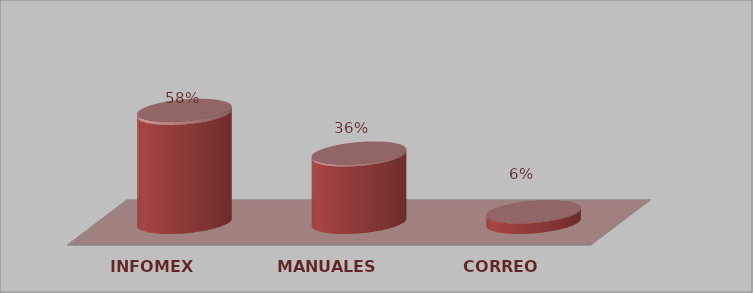
| Category | Series 0 | Series 1 |
|---|---|---|
| INFOMEX | 21 | 0.583 |
| MANUALES | 13 | 0.361 |
| CORREO | 2 | 0.056 |